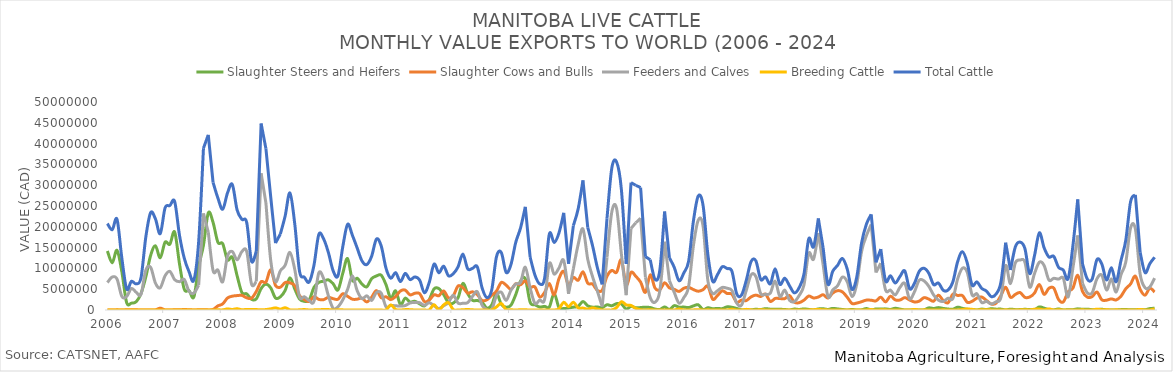
| Category | Slaughter Steers and Heifers | Slaughter Cows and Bulls | Feeders and Calves | Breeding Cattle | Total Cattle |
|---|---|---|---|---|---|
| 2006-01-01 | 14187904 | 5833 | 6591304 | 0 | 20785041 |
| 2006-02-01 | 11341319 | 11648 | 7928039 | 0 | 19281006 |
| 2006-03-01 | 14344812 | 31243 | 7440593 | 0 | 21816648 |
| 2006-04-01 | 9232013 | 18080 | 3279165 | 0 | 12529258 |
| 2006-05-01 | 1794050 | 38548 | 3237103 | 0 | 5069701 |
| 2006-06-01 | 1648332 | 71812 | 5171620 | 0 | 6891764 |
| 2006-07-01 | 1991443 | 43364 | 4253852 | 0 | 6288659 |
| 2006-08-01 | 3992152 | 0 | 3785370 | 0 | 7777522 |
| 2006-09-01 | 7959820 | 21344 | 9592922 | 0 | 17574086 |
| 2006-10-01 | 13127632 | 16458 | 10259279 | 0 | 23403369 |
| 2006-11-01 | 15422609 | 24030 | 6454480 | 0 | 21901119 |
| 2006-12-01 | 12555837 | 442847 | 5345739 | 0 | 18344423 |
| 2007-01-01 | 16281706 | 15391 | 8211393 | 0 | 24508490 |
| 2007-02-01 | 15818791 | 14749 | 9272261 | 0 | 25105801 |
| 2007-03-01 | 18738153 | 39614 | 7294564 | 0 | 26072331 |
| 2007-04-01 | 11161152 | 54176 | 6803755 | 0 | 18019083 |
| 2007-05-01 | 4994892 | 113471 | 7341133 | 0 | 12449496 |
| 2007-06-01 | 4651928 | 60521 | 4475342 | 0 | 9187791 |
| 2007-07-01 | 3135763 | 14576 | 4052472 | 0 | 7202811 |
| 2007-08-01 | 10463968 | 46770 | 5958488 | 0 | 16469226 |
| 2007-09-01 | 15598744 | 89978 | 23212124 | 0 | 38900846 |
| 2007-10-01 | 23343316 | 28135 | 18720277 | 0 | 42091728 |
| 2007-11-01 | 21040201 | 130356 | 9483319 | 0 | 30653876 |
| 2007-12-01 | 16280273 | 985290 | 9595732 | 46023 | 26907318 |
| 2008-01-01 | 15932224 | 1470525 | 6777698 | 33445 | 24213892 |
| 2008-02-01 | 12060461 | 2881618 | 12940348 | 249206 | 28131633 |
| 2008-03-01 | 12678058 | 3323484 | 14044679 | 132714 | 30178935 |
| 2008-04-01 | 8239235 | 3462530 | 12052325 | 294857 | 24048947 |
| 2008-05-01 | 4186915 | 3501724 | 14048994 | 56269 | 21793902 |
| 2008-06-01 | 3886678 | 2929304 | 14069918 | 140988 | 21026888 |
| 2008-07-01 | 2559955 | 2826612 | 6241963 | 124155 | 11752685 |
| 2008-08-01 | 2687825 | 4470797 | 6869086 | 107911 | 14135619 |
| 2008-09-01 | 5149888 | 6795923 | 32851550 | 35083 | 44832444 |
| 2008-10-01 | 6213290 | 6713226 | 25743866 | 109326 | 38779708 |
| 2008-11-01 | 5310735 | 9673176 | 11897774 | 276900 | 27158585 |
| 2008-12-01 | 2876273 | 5896305 | 6812893 | 511510 | 16096981 |
| 2009-01-01 | 3164992 | 5475904 | 9411820 | 197925 | 18250641 |
| 2009-02-01 | 4694803 | 6600046 | 10746835 | 539772 | 22581456 |
| 2009-03-01 | 7731548 | 6522191 | 13842401 | 38125 | 28134265 |
| 2009-04-01 | 5067954 | 5867918 | 9776770 | 7915 | 20720557 |
| 2009-05-01 | 2644755 | 3434314 | 3144349 | 39892 | 9263310 |
| 2009-06-01 | 2083407 | 2512518 | 3179141 | 103917 | 7878983 |
| 2009-07-01 | 2386515 | 2044848 | 2276924 | 12557 | 6720844 |
| 2009-08-01 | 5429442 | 3207333 | 2073322 | 30633 | 10740730 |
| 2009-09-01 | 6627423 | 2552131 | 8898741 | 49341 | 18127636 |
| 2009-10-01 | 6922475 | 2485088 | 7579433 | 132796 | 17119792 |
| 2009-11-01 | 7250504 | 3047411 | 3431969 | 103129 | 13833013 |
| 2009-12-01 | 6298529 | 2716718 | 382006 | 7381 | 9404634 |
| 2010-01-01 | 4826857 | 2593859 | 779081 | 38246 | 8238043 |
| 2010-02-01 | 8830912 | 3926017 | 2431916 | 31465 | 15220310 |
| 2010-03-01 | 12368940 | 3287651 | 4940770 | 0 | 20597361 |
| 2010-04-01 | 7136323 | 2597240 | 8208898 | 13126 | 17955587 |
| 2010-05-01 | 7642450 | 2604035 | 4638542 | 10378 | 14895405 |
| 2010-06-01 | 6217335 | 2841387 | 2723749 | 2617 | 11785088 |
| 2010-07-01 | 5570762 | 1947099 | 3411744 | 0 | 10929605 |
| 2010-08-01 | 7523630 | 3059142 | 2303454 | 15673 | 12901899 |
| 2010-09-01 | 8173951 | 4664316 | 4205856 | 0 | 17044123 |
| 2010-10-01 | 8362797 | 2953517 | 4070458 | 3105 | 15389877 |
| 2010-11-01 | 6072511 | 3170828 | 781666 | 5976 | 10030981 |
| 2010-12-01 | 2811809 | 2490822 | 1096604 | 1236783 | 7636018 |
| 2011-01-01 | 4595242 | 3237427 | 1016720 | 133404 | 8982793 |
| 2011-02-01 | 1309523 | 4564083 | 952847 | 0 | 6826453 |
| 2011-03-01 | 2858451 | 4776678 | 1069838 | 97480 | 8802447 |
| 2011-04-01 | 1903779 | 3639944 | 1678331 | 84601 | 7306655 |
| 2011-05-01 | 2100171 | 4017330 | 1824146 | 5960 | 7947607 |
| 2011-06-01 | 1481477 | 3942235 | 1758460 | 0 | 7182172 |
| 2011-07-01 | 990104 | 2019297 | 1126246 | 6824 | 4142471 |
| 2011-08-01 | 2458787 | 2395786 | 1750711 | 31743 | 6637027 |
| 2011-09-01 | 5074498 | 3652677 | 1010702 | 1291379 | 11029256 |
| 2011-10-01 | 5148920 | 3431319 | 363305 | 0 | 8943544 |
| 2011-11-01 | 3711327 | 4590631 | 1019521 | 1216890 | 10538369 |
| 2011-12-01 | 1724821 | 2917931 | 1799140 | 1776383 | 8218275 |
| 2012-01-01 | 1655396 | 3420608 | 3550341 | 100413 | 8726758 |
| 2012-02-01 | 2952434 | 5772904 | 1660142 | 0 | 10385480 |
| 2012-03-01 | 6396400 | 5362421 | 1617240 | 62267 | 13438328 |
| 2012-04-01 | 3951535 | 4066094 | 1778019 | 115435 | 9911083 |
| 2012-05-01 | 2329784 | 4366583 | 3270806 | 39966 | 10007139 |
| 2012-06-01 | 2279917 | 3708486 | 4391694 | 0 | 10380097 |
| 2012-07-01 | 1859692 | 2292790 | 1156590 | 12977 | 5322049 |
| 2012-08-01 | 452657 | 2448136 | 83976 | 0 | 2984769 |
| 2012-09-01 | 1199275 | 3510483 | 70703 | 0 | 4780461 |
| 2012-10-01 | 4024601 | 4559393 | 3492668 | 745031 | 12821693 |
| 2012-11-01 | 1348416 | 6617060 | 4276794 | 1565345 | 13807615 |
| 2012-12-01 | 671091 | 5982648 | 2322444 | 82150 | 9058333 |
| 2013-01-01 | 1142797 | 4984926 | 4715988 | 50413 | 10894124 |
| 2013-02-01 | 3689936 | 6295369 | 6248138 | 0 | 16233443 |
| 2013-03-01 | 6958552 | 6057976 | 6633666 | 58496 | 19708690 |
| 2013-04-01 | 7479647 | 6986678 | 10284914 | 47893 | 24799132 |
| 2013-05-01 | 1891004 | 5512602 | 5310753 | 0 | 12714359 |
| 2013-06-01 | 1252186 | 5537755 | 1586091 | 22679 | 8398711 |
| 2013-07-01 | 725313 | 3148345 | 2398543 | 0 | 6272201 |
| 2013-08-01 | 874553 | 4199016 | 2482637 | 0 | 7556206 |
| 2013-09-01 | 722089 | 6350757 | 11162610 | 17079 | 18252535 |
| 2013-10-01 | 3979542 | 3630921 | 8621963 | 0 | 16232426 |
| 2013-11-01 | 600510 | 7524782 | 10065407 | 308575 | 18499274 |
| 2013-12-01 | 357307 | 9279548 | 11866661 | 1856383 | 23359899 |
| 2014-01-01 | 493539 | 5942038 | 3877969 | 803830 | 11117376 |
| 2014-02-01 | 682186 | 7839484 | 9896218 | 1868299 | 20286187 |
| 2014-03-01 | 897650 | 7147617 | 15741401 | 509939 | 24296607 |
| 2014-04-01 | 2037349 | 9182224 | 19492498 | 458722 | 31170793 |
| 2014-05-01 | 1000433 | 6440127 | 12175424 | 202478 | 19818462 |
| 2014-06-01 | 687659 | 6234156 | 8006312 | 503563 | 15431690 |
| 2014-07-01 | 720700 | 4693005 | 4539293 | 223275 | 10176273 |
| 2014-08-01 | 578302 | 4746717 | 814266 | 15807 | 6155092 |
| 2014-09-01 | 1254646 | 8111051 | 12623783 | 19381 | 22008861 |
| 2014-10-01 | 1024771 | 9515586 | 23537454 | 0 | 34077811 |
| 2014-11-01 | 1525832 | 9064757 | 24390636 | 596426 | 35577651 |
| 2014-12-01 | 1470098 | 12042779 | 13432839 | 1988911 | 28934627 |
| 2015-01-01 | 236901 | 6038143 | 3551208 | 1228451 | 11054703 |
| 2015-02-01 | 873294 | 9037177 | 19613742 | 1091975 | 30616188 |
| 2015-03-01 | 523419 | 8098251 | 20964680 | 387984 | 29974334 |
| 2015-04-01 | 589216 | 6703437 | 22059439 | 65676 | 29417768 |
| 2015-05-01 | 685783 | 4260767 | 7875331 | 6645 | 12828526 |
| 2015-06-01 | 591428 | 8444089 | 2984759 | 67011 | 12087287 |
| 2015-07-01 | 226439 | 5275911 | 1879538 | 6980 | 7388868 |
| 2015-08-01 | 115084 | 4858880 | 4592052 | 17850 | 9583866 |
| 2015-09-01 | 730582 | 6538549 | 16412230 | 0 | 23681361 |
| 2015-10-01 | 132010 | 5320261 | 7055671 | 21473 | 12529415 |
| 2015-11-01 | 1048706 | 4967963 | 4246971 | 0 | 10263640 |
| 2015-12-01 | 690256 | 4466461 | 1647512 | 233904 | 7038133 |
| 2016-01-01 | 704410 | 5222057 | 2991201 | 13904 | 8931572 |
| 2016-02-01 | 588978 | 5461892 | 5696999 | 12692 | 11760561 |
| 2016-03-01 | 988503 | 4907803 | 15514149 | 25525 | 21435980 |
| 2016-04-01 | 1246707 | 4511591 | 21584608 | 78085 | 27420991 |
| 2016-05-01 | 102204 | 4882765 | 20178611 | 0 | 25163580 |
| 2016-06-01 | 536221 | 5716882 | 7080115 | 34948 | 13368166 |
| 2016-07-01 | 310954 | 2600981 | 4000587 | 0 | 6912522 |
| 2016-08-01 | 379947 | 3478365 | 4626684 | 14553 | 8499549 |
| 2016-09-01 | 334597 | 4619309 | 5422194 | 13830 | 10389930 |
| 2016-10-01 | 762969 | 3975548 | 5234474 | 0 | 9972991 |
| 2016-11-01 | 657444 | 3805498 | 4693416 | 175592 | 9331950 |
| 2016-12-01 | 371492 | 1841875 | 1690905 | 0 | 3904272 |
| 2017-01-01 | 32089 | 2371524 | 1167972 | 0 | 3571585 |
| 2017-02-01 | 4578 | 2265276 | 4711927 | 152285 | 7134066 |
| 2017-03-01 | 20184 | 3159520 | 8448852 | 29519 | 11658075 |
| 2017-04-01 | 176695 | 3579864 | 8034267 | 6158 | 11796984 |
| 2017-05-01 | 98106 | 3246415 | 3938173 | 66931 | 7349625 |
| 2017-06-01 | 322665 | 3820371 | 3784254 | 26115 | 7953405 |
| 2017-07-01 | 195129 | 2053773 | 4052502 | 0 | 6301404 |
| 2017-08-01 | 168303 | 2768911 | 6938554 | 25867 | 9901635 |
| 2017-09-01 | 165026 | 2750890 | 3223282 | 20942 | 6160140 |
| 2017-10-01 | 122629 | 2719424 | 4783194 | 20920 | 7646167 |
| 2017-11-01 | 0 | 3468692 | 2344667 | 0 | 5813359 |
| 2017-12-01 | 228123 | 1876977 | 2011972 | 0 | 4117072 |
| 2018-01-01 | 120815 | 1754497 | 3478608 | 3418 | 5357338 |
| 2018-02-01 | 254665 | 2362605 | 5974673 | 0 | 8591943 |
| 2018-03-01 | 139189 | 3350299 | 13613402 | 20821 | 17123711 |
| 2018-04-01 | 0 | 2889450 | 12226197 | 77020 | 15192667 |
| 2018-05-01 | 258334 | 3114671 | 18511150 | 127877 | 22012032 |
| 2018-06-01 | 303890 | 3669305 | 10899619 | 50517 | 14923331 |
| 2018-07-01 | 131117 | 2864661 | 3232824 | 26196 | 6254798 |
| 2018-08-01 | 387656 | 4087441 | 4824182 | 12297 | 9311576 |
| 2018-09-01 | 253491 | 4648894 | 5823313 | 0 | 10725698 |
| 2018-10-01 | 128357 | 4367623 | 7899262 | 0 | 12395242 |
| 2018-11-01 | 0 | 3079002 | 6830582 | 0 | 9909584 |
| 2018-12-01 | 126180 | 1578768 | 3258035 | 0 | 4962983 |
| 2019-01-01 | 0 | 1668919 | 6276109 | 0 | 7945028 |
| 2019-02-01 | 34857 | 1997599 | 14074725 | 0 | 16107181 |
| 2019-03-01 | 353914 | 2375723 | 17858675 | 25466 | 20613778 |
| 2019-04-01 | 0 | 2345831 | 20541126 | 104201 | 22991158 |
| 2019-05-01 | 255039 | 2195536 | 9010124 | 0 | 11460699 |
| 2019-06-01 | 246509 | 3088066 | 11273309 | 40725 | 14648609 |
| 2019-07-01 | 266277 | 1943733 | 4780863 | 35504 | 7026377 |
| 2019-08-01 | 135914 | 3315748 | 4777255 | 0 | 8228917 |
| 2019-09-01 | 413412 | 2435981 | 3630258 | 6090 | 6485741 |
| 2019-10-01 | 211489 | 2399486 | 5453301 | 0 | 8064276 |
| 2019-11-01 | 0 | 2977493 | 6402249 | 0 | 9379742 |
| 2019-12-01 | 0 | 2412519 | 2684816 | 0 | 5097335 |
| 2020-01-01 | 0 | 1937299 | 4351129 | 125703 | 6414131 |
| 2020-02-01 | 3170 | 2126023 | 7148714 | 0 | 9277907 |
| 2020-03-01 | 10914 | 2967669 | 7010772 | 37813 | 10027168 |
| 2020-04-01 | 513762 | 2621610 | 5681261 | 12723 | 8829356 |
| 2020-05-01 | 364226 | 2120934 | 3611634 | 0 | 6096794 |
| 2020-06-01 | 573968 | 3552029 | 2368110 | 0 | 6494107 |
| 2020-07-01 | 374854 | 2280702 | 2047658 | 40631 | 4743845 |
| 2020-08-01 | 235577 | 1725007 | 2830180 | 0 | 4790764 |
| 2020-09-01 | 173724 | 3803919 | 2761601 | 0 | 6739244 |
| 2020-10-01 | 674990 | 3491895 | 7461132 | 0 | 11628017 |
| 2020-11-01 | 389233 | 3470278 | 10037358 | 113708 | 14010577 |
| 2020-12-01 | 163115 | 1851749 | 9051813 | 239867 | 11306544 |
| 2021-01-01 | 116075 | 2088327 | 3638229 | 157961 | 6000592 |
| 2021-02-01 | 0 | 2849875 | 3912863 | 0 | 6762738 |
| 2021-03-01 | 217255 | 3122711 | 1793345 | 70477 | 5203788 |
| 2021-04-01 | 107304 | 2300189 | 2078459 | 58860 | 4544812 |
| 2021-05-01 | 301866 | 1431621 | 1450431 | 27184 | 3211102 |
| 2021-06-01 | 201209 | 1648874 | 1979175 | 17229 | 3846487 |
| 2021-07-01 | 213985 | 3445306 | 2986168 | 0 | 6645459 |
| 2021-08-01 | 5797 | 5463320 | 10681441 | 32390 | 16182948 |
| 2021-09-01 | 205942 | 3062402 | 6340071 | 0 | 9608415 |
| 2021-10-01 | 86098 | 3748226 | 11302462 | 0 | 15136786 |
| 2021-11-01 | 100441 | 4185550 | 12002077 | 32721 | 16320789 |
| 2021-12-01 | 162998 | 3039676 | 11502154 | 73288 | 14778116 |
| 2022-01-01 | 100335 | 3132944 | 5491788 | 24850 | 8749917 |
| 2022-02-01 | 72185 | 4065387 | 8759756 | 187103 | 13084431 |
| 2022-03-01 | 741973 | 6116630 | 11478177 | 214743 | 18551523 |
| 2022-04-01 | 445223 | 3755526 | 10699706 | 45014 | 14945469 |
| 2022-05-01 | 50958 | 5222313 | 7209942 | 262186 | 12745399 |
| 2022-06-01 | 16024 | 5276579 | 7608222 | 0 | 12900825 |
| 2022-07-01 | 243454 | 2532655 | 7427401 | 62436 | 10265946 |
| 2022-08-01 | 0 | 1956744 | 7624097 | 8076 | 9588917 |
| 2022-09-01 | 73361 | 4335340 | 3129080 | 0 | 7537781 |
| 2022-10-01 | 77172 | 5284970 | 10152759 | 0 | 15514901 |
| 2022-11-01 | 274017 | 8363149 | 17942425 | 12175 | 26591766 |
| 2022-12-01 | 156005 | 4457998 | 6393594 | 36893 | 11044490 |
| 2023-01-01 | 207524 | 3084589 | 4127095 | 0 | 7419208 |
| 2023-02-01 | 73221 | 3209416 | 4149085 | 0 | 7431722 |
| 2023-03-01 | 105724 | 4322333 | 7498428 | 196336 | 12122821 |
| 2023-04-01 | 178470 | 2460136 | 8380790 | 70081 | 11089477 |
| 2023-05-01 | 3955 | 2360504 | 4800628 | 60975 | 7226062 |
| 2023-06-01 | 6175 | 2672430 | 7475534 | 10896 | 10165035 |
| 2023-07-01 | 3145 | 2416314 | 4323072 | 35218 | 6777749 |
| 2023-08-01 | 92174 | 3314126 | 8462018 | 12339 | 11880657 |
| 2023-09-01 | 113570 | 5103447 | 11524517 | 29906 | 16771440 |
| 2023-10-01 | 41866 | 6253948 | 19729767 | 20784 | 26046365 |
| 2023-11-01 | 51590 | 8137455 | 19488395 | 13116 | 27690556 |
| 2023-12-01 | 144474 | 4954990 | 8574711 | 144187 | 13818362 |
| 2024-01-01 | 50690 | 3564968 | 5366958 | 11129 | 8993745 |
| 2024-02-01 | 333173 | 5220085 | 5555962 | 18909 | 11128129 |
| 2024-03-01 | 419181 | 4316120 | 7657532 | 283305 | 12676138 |